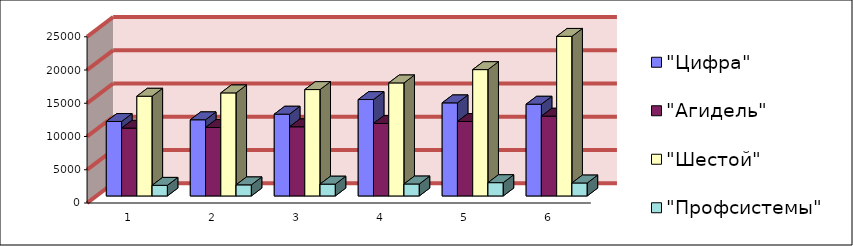
| Category | "Цифра" | "Агидель" | "Шестой" | "Профсистемы" |
|---|---|---|---|---|
| 0 | 11200 | 10200 | 15000 | 1600 |
| 1 | 11455 | 10300 | 15500 | 1670 |
| 2 | 12300 | 10400 | 16000 | 1780 |
| 3 | 14500 | 10900 | 17000 | 1800 |
| 4 | 14000 | 11200 | 19000 | 2000 |
| 5 | 13800 | 12000 | 24000 | 1950 |